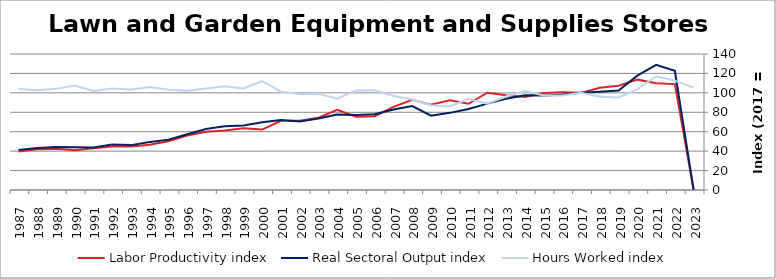
| Category | Labor Productivity index | Real Sectoral Output index | Hours Worked index |
|---|---|---|---|
| 2023.0 | 0 | 0 | 105.383 |
| 2022.0 | 109.003 | 122.71 | 112.575 |
| 2021.0 | 109.994 | 128.843 | 117.137 |
| 2020.0 | 113.594 | 117.748 | 103.656 |
| 2019.0 | 107.414 | 102.376 | 95.31 |
| 2018.0 | 105.185 | 101.039 | 96.058 |
| 2017.0 | 100 | 100 | 100 |
| 2016.0 | 100.697 | 98.062 | 97.383 |
| 2015.0 | 99.954 | 97.277 | 97.321 |
| 2014.0 | 95.67 | 97.413 | 101.822 |
| 2013.0 | 97.608 | 93.921 | 96.222 |
| 2012.0 | 100.133 | 88.883 | 88.765 |
| 2011.0 | 88.743 | 83.366 | 93.941 |
| 2010.0 | 92.292 | 79.409 | 86.042 |
| 2009.0 | 87.763 | 76.532 | 87.204 |
| 2008.0 | 92.755 | 86.469 | 93.223 |
| 2007.0 | 85.529 | 82.844 | 96.861 |
| 2006.0 | 76.001 | 78.06 | 102.709 |
| 2005.0 | 75.402 | 77.277 | 102.487 |
| 2004.0 | 82.581 | 77.68 | 94.066 |
| 2003.0 | 74.388 | 73.636 | 98.99 |
| 2002.0 | 71.252 | 70.43 | 98.847 |
| 2001.0 | 71.212 | 72.057 | 101.188 |
| 2000.0 | 62.209 | 69.749 | 112.121 |
| 1999.0 | 63.453 | 66.377 | 104.608 |
| 1998.0 | 61.289 | 65.503 | 106.876 |
| 1997.0 | 60.055 | 62.73 | 104.455 |
| 1996.0 | 56.058 | 57.342 | 102.29 |
| 1995.0 | 50.09 | 51.649 | 103.112 |
| 1994.0 | 46.638 | 49.392 | 105.906 |
| 1993.0 | 44.675 | 46.208 | 103.431 |
| 1992.0 | 44.751 | 46.775 | 104.522 |
| 1991.0 | 42.911 | 43.785 | 102.038 |
| 1990.0 | 40.953 | 44.016 | 107.478 |
| 1989.0 | 42.521 | 44.268 | 104.109 |
| 1988.0 | 42.001 | 43.113 | 102.649 |
| 1987.0 | 39.721 | 41.309 | 103.997 |